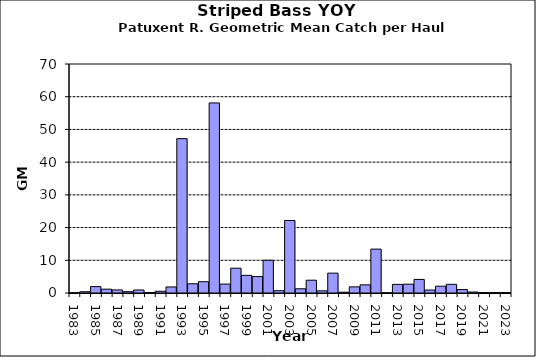
| Category | Series 0 |
|---|---|
| 1983.0 | 0.039 |
| 1984.0 | 0.387 |
| 1985.0 | 1.951 |
| 1986.0 | 1.168 |
| 1987.0 | 0.94 |
| 1988.0 | 0.404 |
| 1989.0 | 0.923 |
| 1990.0 | 0.167 |
| 1991.0 | 0.532 |
| 1992.0 | 1.85 |
| 1993.0 | 47.183 |
| 1994.0 | 2.819 |
| 1995.0 | 3.458 |
| 1996.0 | 58.106 |
| 1997.0 | 2.725 |
| 1998.0 | 7.582 |
| 1999.0 | 5.393 |
| 2000.0 | 5.028 |
| 2001.0 | 10.009 |
| 2002.0 | 0.692 |
| 2003.0 | 22.17 |
| 2004.0 | 1.29 |
| 2005.0 | 3.909 |
| 2006.0 | 0.661 |
| 2007.0 | 6.069 |
| 2008.0 | 0.24 |
| 2009.0 | 1.873 |
| 2010.0 | 2.49 |
| 2011.0 | 13.415 |
| 2012.0 | 0.039 |
| 2013.0 | 2.633 |
| 2014.0 | 2.7 |
| 2015.0 | 4.15 |
| 2016.0 | 0.902 |
| 2017.0 | 2.075 |
| 2018.0 | 2.65 |
| 2019.0 | 1.05 |
| 2020.0 | 0.3 |
| 2021.0 | 0.122 |
| 2022.0 | 0.122 |
| 2023.0 | 0.122 |